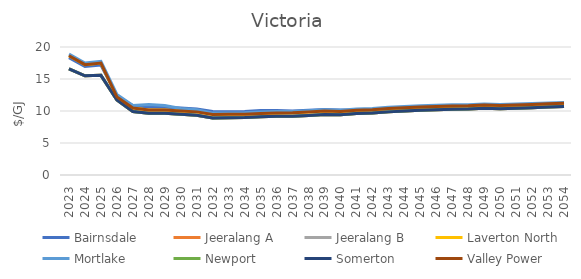
| Category | Bairnsdale | Jeeralang A | Jeeralang B | Laverton North | Mortlake | Newport | Somerton | Valley Power |
|---|---|---|---|---|---|---|---|---|
| 2023.0 | 18.319 | 16.587 | 16.587 | 18.629 | 18.894 | 16.587 | 16.587 | 18.629 |
| 2024.0 | 16.945 | 15.496 | 15.496 | 17.24 | 17.495 | 15.496 | 15.496 | 17.24 |
| 2025.0 | 17.19 | 15.571 | 15.571 | 17.494 | 17.75 | 15.571 | 15.571 | 17.494 |
| 2026.0 | 12.353 | 11.71 | 11.71 | 12.21 | 12.576 | 11.71 | 11.71 | 12.21 |
| 2027.0 | 10.863 | 9.93 | 9.93 | 10.455 | 10.878 | 9.93 | 9.93 | 10.455 |
| 2028.0 | 10.629 | 9.65 | 9.65 | 10.175 | 11.01 | 9.65 | 9.65 | 10.175 |
| 2029.0 | 10.579 | 9.643 | 9.643 | 10.168 | 10.86 | 9.643 | 9.643 | 10.168 |
| 2030.0 | 10.451 | 9.486 | 9.486 | 10.011 | 10.408 | 9.486 | 9.486 | 10.011 |
| 2031.0 | 10.318 | 9.339 | 9.339 | 9.864 | 10.2 | 9.339 | 9.339 | 9.864 |
| 2032.0 | 9.92 | 8.924 | 8.924 | 9.449 | 9.671 | 8.924 | 8.924 | 9.449 |
| 2033.0 | 9.886 | 8.948 | 8.948 | 9.473 | 9.692 | 8.948 | 8.948 | 9.473 |
| 2034.0 | 9.919 | 8.986 | 8.986 | 9.511 | 9.728 | 8.986 | 8.986 | 9.511 |
| 2035.0 | 10.066 | 9.099 | 9.099 | 9.624 | 9.839 | 9.099 | 9.099 | 9.624 |
| 2036.0 | 10.063 | 9.175 | 9.175 | 9.7 | 9.913 | 9.175 | 9.175 | 9.7 |
| 2037.0 | 10.008 | 9.195 | 9.195 | 9.72 | 9.931 | 9.195 | 9.195 | 9.72 |
| 2038.0 | 10.122 | 9.308 | 9.308 | 9.833 | 10.042 | 9.308 | 9.308 | 9.833 |
| 2039.0 | 10.252 | 9.457 | 9.457 | 9.982 | 10.19 | 9.457 | 9.457 | 9.982 |
| 2040.0 | 10.167 | 9.396 | 9.396 | 9.909 | 10.109 | 9.396 | 9.396 | 9.909 |
| 2041.0 | 10.139 | 9.612 | 9.612 | 10.125 | 10.323 | 9.612 | 9.612 | 10.125 |
| 2042.0 | 10.008 | 9.686 | 9.686 | 10.198 | 10.395 | 9.686 | 9.686 | 10.198 |
| 2043.0 | 10.177 | 9.863 | 9.863 | 10.375 | 10.57 | 9.863 | 9.863 | 10.375 |
| 2044.0 | 10.273 | 9.99 | 9.99 | 10.503 | 10.695 | 9.99 | 9.99 | 10.503 |
| 2045.0 | 10.389 | 10.106 | 10.106 | 10.619 | 10.809 | 10.106 | 10.106 | 10.619 |
| 2046.0 | 10.485 | 10.202 | 10.202 | 10.714 | 10.903 | 10.202 | 10.202 | 10.714 |
| 2047.0 | 10.576 | 10.277 | 10.277 | 10.789 | 10.968 | 10.277 | 10.277 | 10.789 |
| 2048.0 | 10.602 | 10.294 | 10.294 | 10.807 | 10.976 | 10.294 | 10.294 | 10.807 |
| 2049.0 | 10.703 | 10.414 | 10.414 | 10.927 | 11.088 | 10.414 | 10.414 | 10.927 |
| 2050.0 | 10.633 | 10.348 | 10.348 | 10.853 | 11.004 | 10.348 | 10.348 | 10.853 |
| 2051.0 | 10.721 | 10.434 | 10.434 | 10.939 | 11.084 | 10.434 | 10.434 | 10.939 |
| 2052.0 | 10.809 | 10.521 | 10.521 | 11.026 | 11.164 | 10.521 | 10.521 | 11.026 |
| 2053.0 | 10.898 | 10.609 | 10.609 | 11.114 | 11.245 | 10.609 | 10.609 | 11.114 |
| 2054.0 | 10.987 | 10.698 | 10.698 | 11.202 | 11.326 | 10.698 | 10.698 | 11.202 |